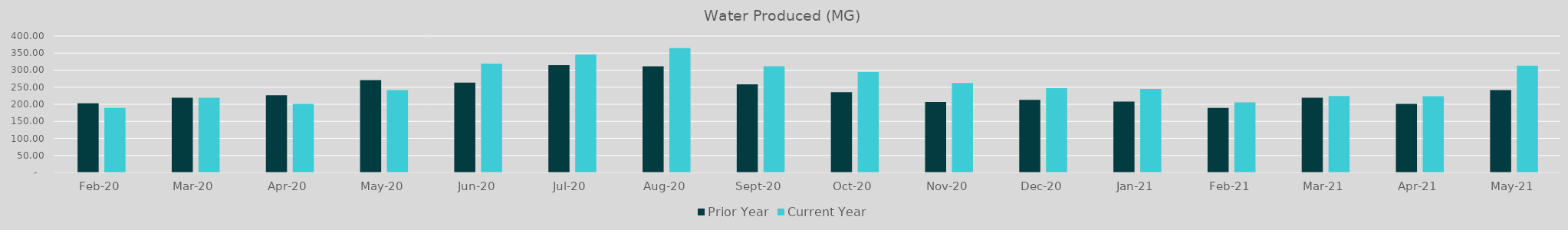
| Category | Prior Year | Current Year |
|---|---|---|
| 2020-02-01 | 202.92 | 189.14 |
| 2020-03-01 | 218.89 | 218.9 |
| 2020-04-01 | 226.62 | 201.4 |
| 2020-05-01 | 270.85 | 241.3 |
| 2020-06-01 | 263.67 | 318.9 |
| 2020-07-01 | 314.55 | 345.4 |
| 2020-08-01 | 311.17 | 364.8 |
| 2020-09-01 | 258.3 | 311 |
| 2020-10-01 | 235.52 | 294.3 |
| 2020-11-01 | 207.02 | 262.21 |
| 2020-12-01 | 212.652 | 246.95 |
| 2021-01-01 | 208.082 | 244.698 |
| 2021-02-01 | 189.14 | 205.51 |
| 2021-03-01 | 218.9 | 223.92 |
| 2021-04-01 | 201.4 | 223.48 |
| 2021-05-01 | 241.3 | 312.74 |